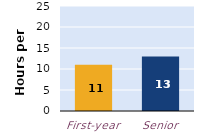
| Category | hours per week |
|---|---|
| First-year | 11 |
| Senior | 13 |